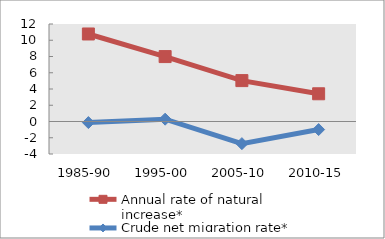
| Category | Annual rate of natural increase* | Crude net migration rate* |
|---|---|---|
| 1985-90 | 10.772 | -0.134 |
| 1995-00 | 7.989 | 0.286 |
| 2005-10 | 5.034 | -2.724 |
| 2010-15 | 3.413 | -0.993 |